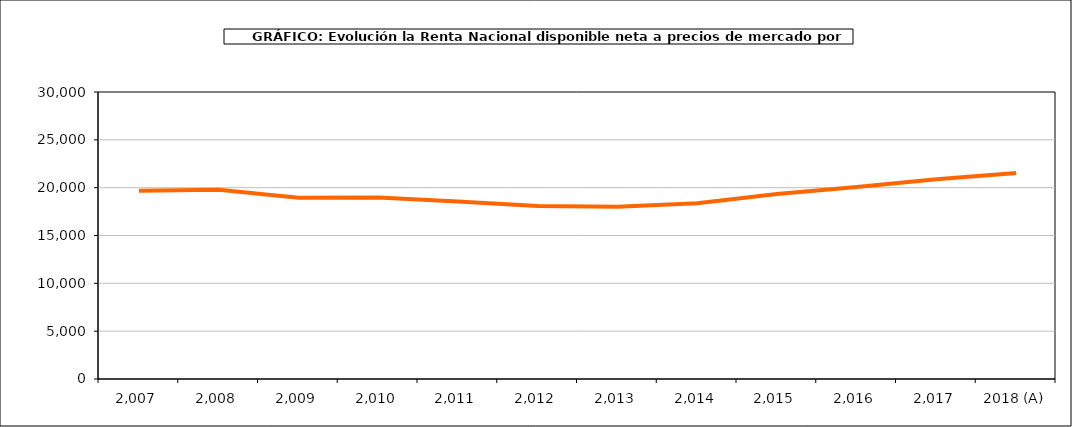
| Category | Renta por habitante |
|---|---|
| 2,007 | 19690.313 |
| 2,008 | 19777.679 |
| 2,009 | 18940.088 |
| 2,010 | 18962.545 |
| 2,011 | 18556.102 |
| 2,012 | 18089.488 |
| 2,013 | 17996.137 |
| 2,014 | 18366.527 |
| 2,015 | 19348.309 |
| 2,016 | 20067.75 |
| 2,017 | 20888.38 |
| 2018 (A) | 21544.822 |